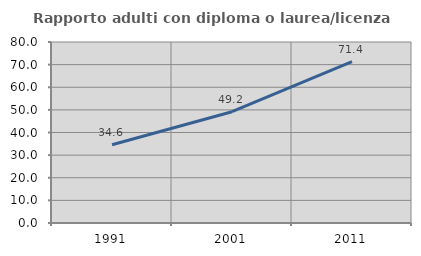
| Category | Rapporto adulti con diploma o laurea/licenza media  |
|---|---|
| 1991.0 | 34.602 |
| 2001.0 | 49.185 |
| 2011.0 | 71.357 |